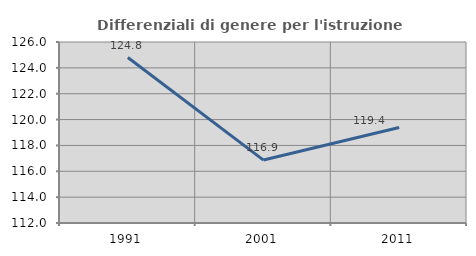
| Category | Differenziali di genere per l'istruzione superiore |
|---|---|
| 1991.0 | 124.801 |
| 2001.0 | 116.867 |
| 2011.0 | 119.383 |